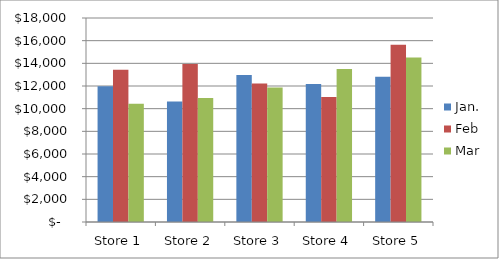
| Category | Jan. | Feb | Mar |
|---|---|---|---|
| Store 1 | 11976 | 13428 | 10426 |
| Store 2 | 10629 | 13948 | 10948 |
| Store 3 | 12978 | 12210 | 11878 |
| Store 4 | 12169 | 11038 | 13508 |
| Store 5 | 12819 | 15636 | 14512 |